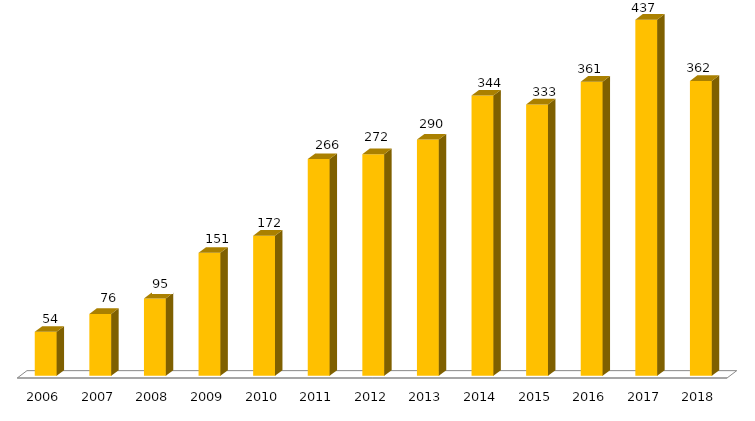
| Category | Programa |
|---|---|
| 2006.0 | 54 |
| 2007.0 | 76 |
| 2008.0 | 95 |
| 2009.0 | 151 |
| 2010.0 | 172 |
| 2011.0 | 266 |
| 2012.0 | 272 |
| 2013.0 | 290 |
| 2014.0 | 344 |
| 2015.0 | 333 |
| 2016.0 | 361 |
| 2017.0 | 437 |
| 2018.0 | 362 |